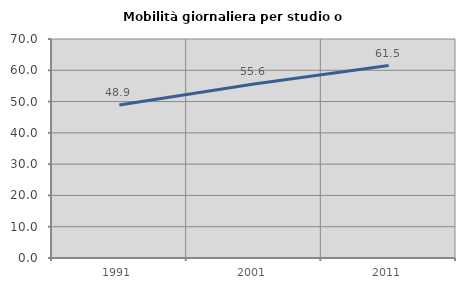
| Category | Mobilità giornaliera per studio o lavoro |
|---|---|
| 1991.0 | 48.896 |
| 2001.0 | 55.593 |
| 2011.0 | 61.508 |